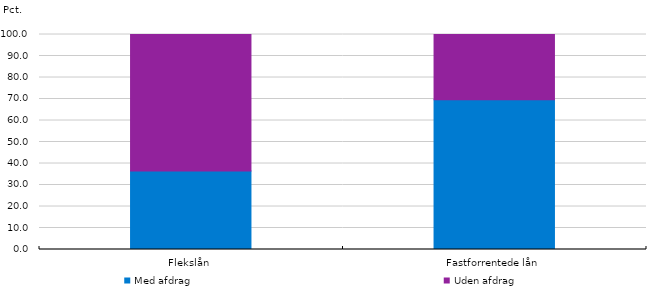
| Category | Med afdrag | Uden afdrag |
|---|---|---|
| Flekslån | 36.486 | 63.514 |
| Fastforrentede lån | 69.669 | 30.331 |